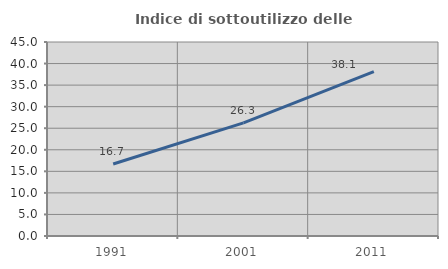
| Category | Indice di sottoutilizzo delle abitazioni  |
|---|---|
| 1991.0 | 16.7 |
| 2001.0 | 26.256 |
| 2011.0 | 38.129 |